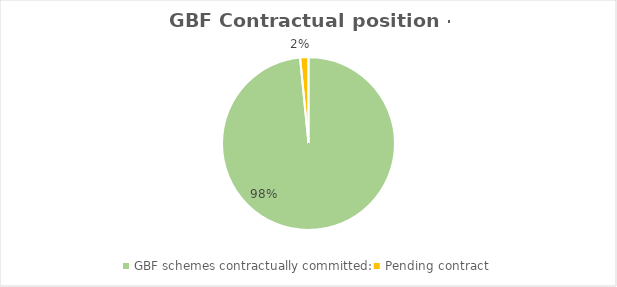
| Category | Series 0 |
|---|---|
| GBF schemes contractually committed: | 0.984 |
| Pending contract  | 0.016 |